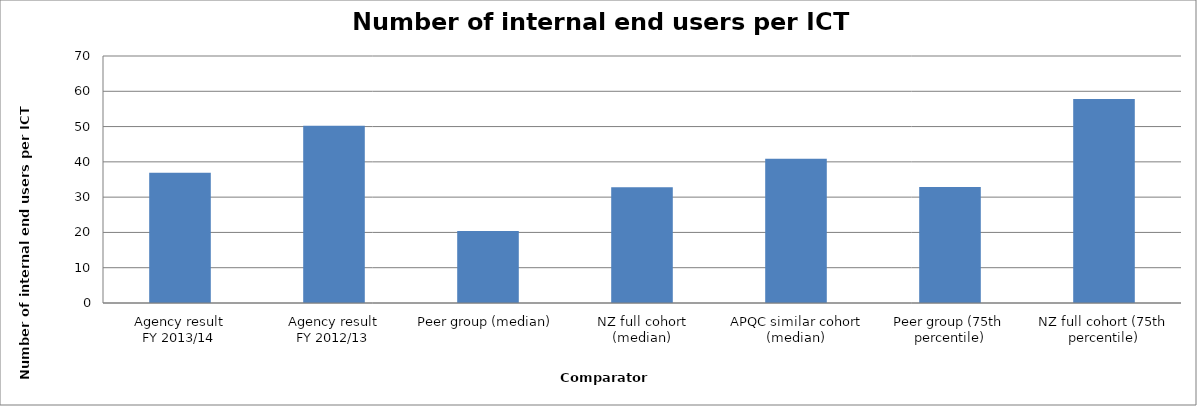
| Category | Result |
|---|---|
| Agency result
FY 2013/14 | 36.907 |
| Agency result
FY 2012/13 | 50.237 |
| Peer group (median) | 20.39 |
| NZ full cohort (median) | 32.819 |
| APQC similar cohort (median) | 40.87 |
| Peer group (75th percentile) | 32.902 |
| NZ full cohort (75th percentile) | 57.783 |